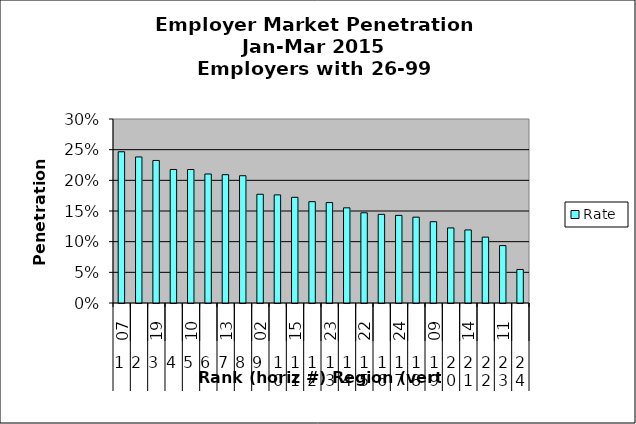
| Category | Rate |
|---|---|
| 0 | 0.247 |
| 1 | 0.238 |
| 2 | 0.232 |
| 3 | 0.218 |
| 4 | 0.218 |
| 5 | 0.21 |
| 6 | 0.209 |
| 7 | 0.208 |
| 8 | 0.177 |
| 9 | 0.176 |
| 10 | 0.172 |
| 11 | 0.165 |
| 12 | 0.164 |
| 13 | 0.155 |
| 14 | 0.147 |
| 15 | 0.145 |
| 16 | 0.143 |
| 17 | 0.14 |
| 18 | 0.133 |
| 19 | 0.122 |
| 20 | 0.119 |
| 21 | 0.107 |
| 22 | 0.094 |
| 23 | 0.055 |